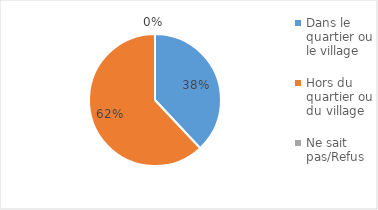
| Category | Series 0 |
|---|---|
| Dans le quartier ou le village | 0.38 |
| Hors du quartier ou du village | 0.62 |
| Ne sait pas/Refus | 0 |